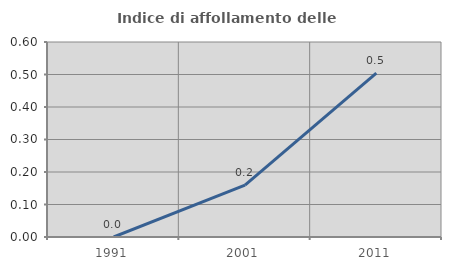
| Category | Indice di affollamento delle abitazioni  |
|---|---|
| 1991.0 | 0 |
| 2001.0 | 0.159 |
| 2011.0 | 0.504 |